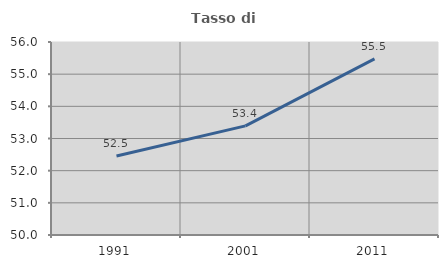
| Category | Tasso di occupazione   |
|---|---|
| 1991.0 | 52.457 |
| 2001.0 | 53.393 |
| 2011.0 | 55.474 |